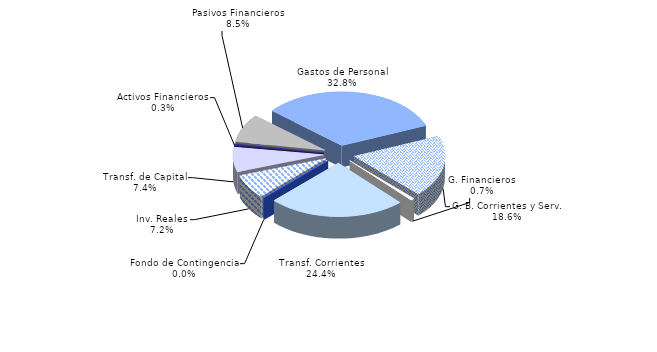
| Category | Series 0 |
|---|---|
| Gastos de Personal | 32.783 |
| G. B. Corrientes y Serv. | 18.611 |
| G. Financieros | 0.661 |
| Transf. Corrientes | 24.422 |
| Fondo de Contingencia | 0.026 |
| Inv. Reales | 7.246 |
| Transf. de Capital | 7.42 |
| Activos Financieros | 0.345 |
| Pasivos Financieros | 8.486 |